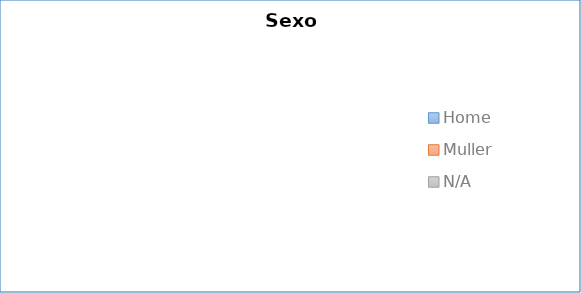
| Category | Sexo |
|---|---|
| Home | 0 |
| Muller | 0 |
| N/A | 0 |